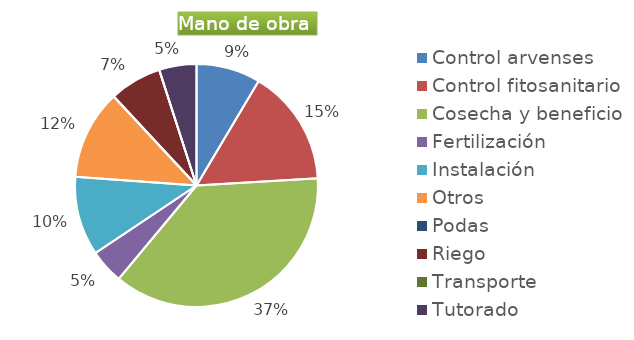
| Category | Series 0 |
|---|---|
| Control arvenses | 2150000 |
| Control fitosanitario | 3900000 |
| Cosecha y beneficio | 9310000 |
| Fertilización | 1150000 |
| Instalación | 2650000 |
| Otros | 3000000 |
| Podas | 0 |
| Riego | 1750000 |
| Transporte | 0 |
| Tutorado | 1250000 |